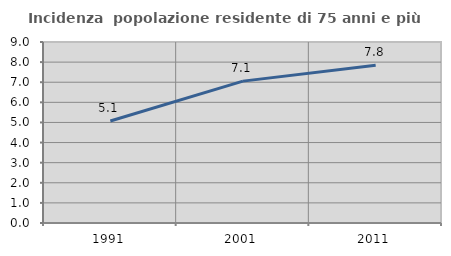
| Category | Incidenza  popolazione residente di 75 anni e più |
|---|---|
| 1991.0 | 5.071 |
| 2001.0 | 7.054 |
| 2011.0 | 7.848 |